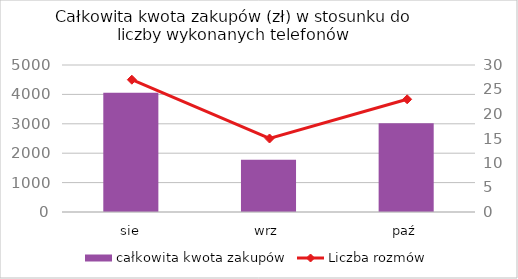
| Category | całkowita kwota zakupów |
|---|---|
| sie | 4057 |
| wrz | 1773 |
| paź | 3021 |